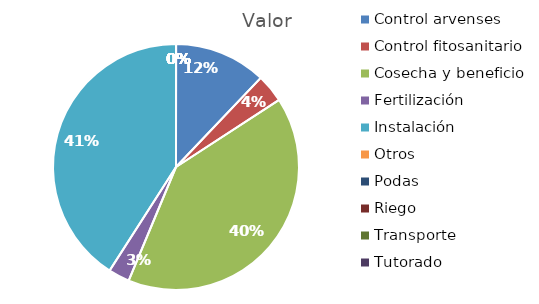
| Category | Valor |
|---|---|
| Control arvenses | 941382 |
| Control fitosanitario | 289656 |
| Cosecha y beneficio | 3150000 |
| Fertilización | 217242 |
| Instalación | 3186216 |
| Otros | 0 |
| Podas | 0 |
| Riego | 0 |
| Transporte | 0 |
| Tutorado | 0 |